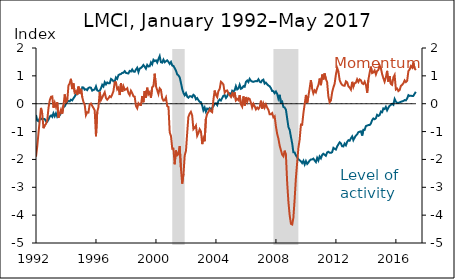
| Category | Level of activity indicator |
|---|---|
| 1992-01-01 | -0.404 |
| 1992-02-01 | -0.605 |
| 1992-03-01 | -0.629 |
| 1992-04-01 | -0.522 |
| 1992-05-01 | -0.556 |
| 1992-06-01 | -0.529 |
| 1992-07-01 | -0.546 |
| 1992-08-01 | -0.553 |
| 1992-09-01 | -0.635 |
| 1992-10-01 | -0.646 |
| 1992-11-01 | -0.564 |
| 1992-12-01 | -0.463 |
| 1993-01-01 | -0.42 |
| 1993-02-01 | -0.472 |
| 1993-03-01 | -0.342 |
| 1993-04-01 | -0.449 |
| 1993-05-01 | -0.343 |
| 1993-06-01 | -0.466 |
| 1993-07-01 | -0.396 |
| 1993-08-01 | -0.413 |
| 1993-09-01 | -0.339 |
| 1993-10-01 | -0.268 |
| 1993-11-01 | -0.118 |
| 1993-12-01 | -0.094 |
| 1994-01-01 | 0.007 |
| 1994-02-01 | 0.069 |
| 1994-03-01 | 0.096 |
| 1994-04-01 | 0.086 |
| 1994-05-01 | 0.143 |
| 1994-06-01 | 0.118 |
| 1994-07-01 | 0.192 |
| 1994-08-01 | 0.259 |
| 1994-09-01 | 0.337 |
| 1994-10-01 | 0.338 |
| 1994-11-01 | 0.445 |
| 1994-12-01 | 0.447 |
| 1995-01-01 | 0.437 |
| 1995-02-01 | 0.588 |
| 1995-03-01 | 0.583 |
| 1995-04-01 | 0.504 |
| 1995-05-01 | 0.524 |
| 1995-06-01 | 0.488 |
| 1995-07-01 | 0.568 |
| 1995-08-01 | 0.586 |
| 1995-09-01 | 0.573 |
| 1995-10-01 | 0.469 |
| 1995-11-01 | 0.496 |
| 1995-12-01 | 0.512 |
| 1996-01-01 | 0.624 |
| 1996-02-01 | 0.477 |
| 1996-03-01 | 0.46 |
| 1996-04-01 | 0.462 |
| 1996-05-01 | 0.549 |
| 1996-06-01 | 0.676 |
| 1996-07-01 | 0.619 |
| 1996-08-01 | 0.772 |
| 1996-09-01 | 0.694 |
| 1996-10-01 | 0.763 |
| 1996-11-01 | 0.733 |
| 1996-12-01 | 0.736 |
| 1997-01-01 | 0.888 |
| 1997-02-01 | 0.859 |
| 1997-03-01 | 0.805 |
| 1997-04-01 | 0.794 |
| 1997-05-01 | 0.945 |
| 1997-06-01 | 0.893 |
| 1997-07-01 | 1.027 |
| 1997-08-01 | 1.055 |
| 1997-09-01 | 1.066 |
| 1997-10-01 | 1.106 |
| 1997-11-01 | 1.114 |
| 1997-12-01 | 1.169 |
| 1998-01-01 | 1.107 |
| 1998-02-01 | 1.093 |
| 1998-03-01 | 1.085 |
| 1998-04-01 | 1.176 |
| 1998-05-01 | 1.156 |
| 1998-06-01 | 1.228 |
| 1998-07-01 | 1.154 |
| 1998-08-01 | 1.146 |
| 1998-09-01 | 1.229 |
| 1998-10-01 | 1.29 |
| 1998-11-01 | 1.133 |
| 1998-12-01 | 1.263 |
| 1999-01-01 | 1.285 |
| 1999-02-01 | 1.33 |
| 1999-03-01 | 1.39 |
| 1999-04-01 | 1.33 |
| 1999-05-01 | 1.259 |
| 1999-06-01 | 1.393 |
| 1999-07-01 | 1.339 |
| 1999-08-01 | 1.343 |
| 1999-09-01 | 1.484 |
| 1999-10-01 | 1.413 |
| 1999-11-01 | 1.576 |
| 1999-12-01 | 1.531 |
| 2000-01-01 | 1.556 |
| 2000-02-01 | 1.478 |
| 2000-03-01 | 1.6 |
| 2000-04-01 | 1.71 |
| 2000-05-01 | 1.488 |
| 2000-06-01 | 1.474 |
| 2000-07-01 | 1.581 |
| 2000-08-01 | 1.488 |
| 2000-09-01 | 1.526 |
| 2000-10-01 | 1.557 |
| 2000-11-01 | 1.499 |
| 2000-12-01 | 1.429 |
| 2001-01-01 | 1.497 |
| 2001-02-01 | 1.369 |
| 2001-03-01 | 1.359 |
| 2001-04-01 | 1.277 |
| 2001-05-01 | 1.192 |
| 2001-06-01 | 1.054 |
| 2001-07-01 | 1.017 |
| 2001-08-01 | 0.948 |
| 2001-09-01 | 0.746 |
| 2001-10-01 | 0.528 |
| 2001-11-01 | 0.386 |
| 2001-12-01 | 0.303 |
| 2002-01-01 | 0.38 |
| 2002-02-01 | 0.249 |
| 2002-03-01 | 0.217 |
| 2002-04-01 | 0.27 |
| 2002-05-01 | 0.27 |
| 2002-06-01 | 0.235 |
| 2002-07-01 | 0.32 |
| 2002-08-01 | 0.28 |
| 2002-09-01 | 0.158 |
| 2002-10-01 | 0.202 |
| 2002-11-01 | 0.125 |
| 2002-12-01 | 0.067 |
| 2003-01-01 | 0.054 |
| 2003-02-01 | -0.067 |
| 2003-03-01 | -0.239 |
| 2003-04-01 | -0.137 |
| 2003-05-01 | -0.286 |
| 2003-06-01 | -0.175 |
| 2003-07-01 | -0.196 |
| 2003-08-01 | -0.155 |
| 2003-09-01 | -0.231 |
| 2003-10-01 | -0.145 |
| 2003-11-01 | -0.088 |
| 2003-12-01 | 0.006 |
| 2004-01-01 | 0.018 |
| 2004-02-01 | -0.049 |
| 2004-03-01 | 0.1 |
| 2004-04-01 | 0.153 |
| 2004-05-01 | 0.114 |
| 2004-06-01 | 0.204 |
| 2004-07-01 | 0.286 |
| 2004-08-01 | 0.31 |
| 2004-09-01 | 0.206 |
| 2004-10-01 | 0.27 |
| 2004-11-01 | 0.384 |
| 2004-12-01 | 0.374 |
| 2005-01-01 | 0.299 |
| 2005-02-01 | 0.465 |
| 2005-03-01 | 0.433 |
| 2005-04-01 | 0.485 |
| 2005-05-01 | 0.632 |
| 2005-06-01 | 0.514 |
| 2005-07-01 | 0.544 |
| 2005-08-01 | 0.68 |
| 2005-09-01 | 0.536 |
| 2005-10-01 | 0.561 |
| 2005-11-01 | 0.631 |
| 2005-12-01 | 0.61 |
| 2006-01-01 | 0.786 |
| 2006-02-01 | 0.833 |
| 2006-03-01 | 0.777 |
| 2006-04-01 | 0.892 |
| 2006-05-01 | 0.824 |
| 2006-06-01 | 0.796 |
| 2006-07-01 | 0.784 |
| 2006-08-01 | 0.803 |
| 2006-09-01 | 0.813 |
| 2006-10-01 | 0.807 |
| 2006-11-01 | 0.879 |
| 2006-12-01 | 0.791 |
| 2007-01-01 | 0.769 |
| 2007-02-01 | 0.843 |
| 2007-03-01 | 0.865 |
| 2007-04-01 | 0.723 |
| 2007-05-01 | 0.757 |
| 2007-06-01 | 0.698 |
| 2007-07-01 | 0.655 |
| 2007-08-01 | 0.627 |
| 2007-09-01 | 0.558 |
| 2007-10-01 | 0.456 |
| 2007-11-01 | 0.451 |
| 2007-12-01 | 0.376 |
| 2008-01-01 | 0.438 |
| 2008-02-01 | 0.351 |
| 2008-03-01 | 0.183 |
| 2008-04-01 | 0.319 |
| 2008-05-01 | 0.045 |
| 2008-06-01 | 0.077 |
| 2008-07-01 | -0.12 |
| 2008-08-01 | -0.136 |
| 2008-09-01 | -0.22 |
| 2008-10-01 | -0.528 |
| 2008-11-01 | -0.842 |
| 2008-12-01 | -0.941 |
| 2009-01-01 | -1.193 |
| 2009-02-01 | -1.433 |
| 2009-03-01 | -1.743 |
| 2009-04-01 | -1.751 |
| 2009-05-01 | -1.855 |
| 2009-06-01 | -1.923 |
| 2009-07-01 | -1.995 |
| 2009-08-01 | -2.031 |
| 2009-09-01 | -2.069 |
| 2009-10-01 | -2.131 |
| 2009-11-01 | -2.048 |
| 2009-12-01 | -2.182 |
| 2010-01-01 | -2.06 |
| 2010-02-01 | -2.162 |
| 2010-03-01 | -2.112 |
| 2010-04-01 | -2.04 |
| 2010-05-01 | -2.004 |
| 2010-06-01 | -1.999 |
| 2010-07-01 | -1.971 |
| 2010-08-01 | -2.038 |
| 2010-09-01 | -2.095 |
| 2010-10-01 | -1.944 |
| 2010-11-01 | -2.039 |
| 2010-12-01 | -1.891 |
| 2011-01-01 | -1.96 |
| 2011-02-01 | -1.838 |
| 2011-03-01 | -1.796 |
| 2011-04-01 | -1.833 |
| 2011-05-01 | -1.869 |
| 2011-06-01 | -1.749 |
| 2011-07-01 | -1.724 |
| 2011-08-01 | -1.759 |
| 2011-09-01 | -1.765 |
| 2011-10-01 | -1.742 |
| 2011-11-01 | -1.584 |
| 2011-12-01 | -1.619 |
| 2012-01-01 | -1.646 |
| 2012-02-01 | -1.531 |
| 2012-03-01 | -1.46 |
| 2012-04-01 | -1.385 |
| 2012-05-01 | -1.421 |
| 2012-06-01 | -1.529 |
| 2012-07-01 | -1.533 |
| 2012-08-01 | -1.43 |
| 2012-09-01 | -1.493 |
| 2012-10-01 | -1.37 |
| 2012-11-01 | -1.31 |
| 2012-12-01 | -1.33 |
| 2013-01-01 | -1.241 |
| 2013-02-01 | -1.174 |
| 2013-03-01 | -1.308 |
| 2013-04-01 | -1.219 |
| 2013-05-01 | -1.144 |
| 2013-06-01 | -1.1 |
| 2013-07-01 | -1.022 |
| 2013-08-01 | -1.006 |
| 2013-09-01 | -0.99 |
| 2013-10-01 | -1.142 |
| 2013-11-01 | -0.937 |
| 2013-12-01 | -0.939 |
| 2014-01-01 | -0.803 |
| 2014-02-01 | -0.782 |
| 2014-03-01 | -0.768 |
| 2014-04-01 | -0.766 |
| 2014-05-01 | -0.713 |
| 2014-06-01 | -0.594 |
| 2014-07-01 | -0.53 |
| 2014-08-01 | -0.557 |
| 2014-09-01 | -0.523 |
| 2014-10-01 | -0.398 |
| 2014-11-01 | -0.437 |
| 2014-12-01 | -0.409 |
| 2015-01-01 | -0.281 |
| 2015-02-01 | -0.305 |
| 2015-03-01 | -0.17 |
| 2015-04-01 | -0.193 |
| 2015-05-01 | -0.113 |
| 2015-06-01 | -0.236 |
| 2015-07-01 | -0.144 |
| 2015-08-01 | -0.075 |
| 2015-09-01 | -0.043 |
| 2015-10-01 | -0.003 |
| 2015-11-01 | -0.04 |
| 2015-12-01 | 0.168 |
| 2016-01-01 | 0.075 |
| 2016-02-01 | 0.031 |
| 2016-03-01 | 0.029 |
| 2016-04-01 | 0.05 |
| 2016-05-01 | 0.067 |
| 2016-06-01 | 0.087 |
| 2016-07-01 | 0.098 |
| 2016-08-01 | 0.131 |
| 2016-09-01 | 0.12 |
| 2016-10-01 | 0.186 |
| 2016-11-01 | 0.307 |
| 2016-12-01 | 0.279 |
| 2017-01-01 | 0.289 |
| 2017-02-01 | 0.277 |
| 2017-03-01 | 0.28 |
| 2017-04-01 | 0.357 |
| 2017-05-01 | 0.426 |